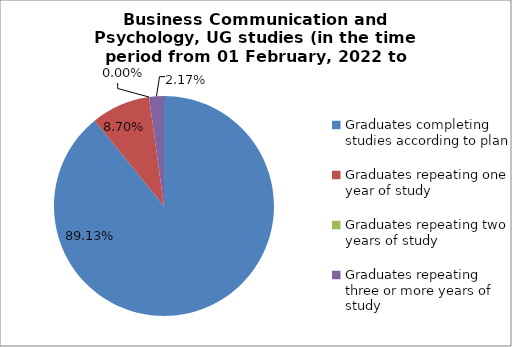
| Category | Series 0 |
|---|---|
| Graduates completing studies according to plan | 89.13 |
| Graduates repeating one year of study | 8.696 |
| Graduates repeating two years of study | 0 |
| Graduates repeating three or more years of study | 2.174 |